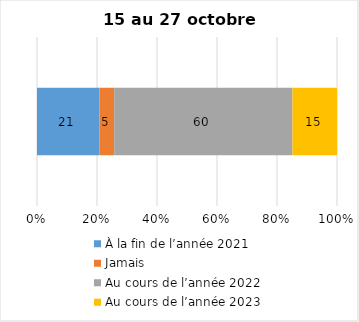
| Category | À la fin de l’année 2021 | Jamais | Au cours de l’année 2022 | Au cours de l’année 2023 |
|---|---|---|---|---|
| 0 | 21 | 5 | 60 | 15 |